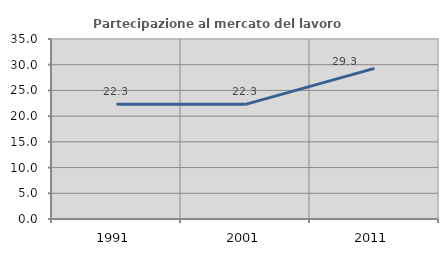
| Category | Partecipazione al mercato del lavoro  femminile |
|---|---|
| 1991.0 | 22.293 |
| 2001.0 | 22.296 |
| 2011.0 | 29.286 |